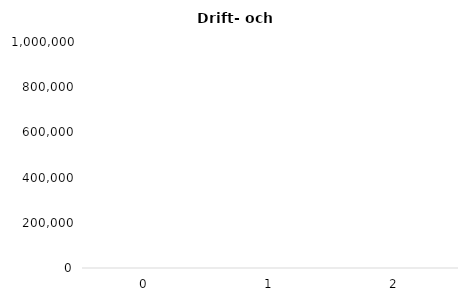
| Category | Drift/förvaltningskostnader |
|---|---|
| 0.0 | 0 |
| 1.0 | 0 |
| 2.0 | 0 |